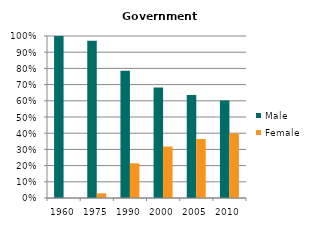
| Category | Male | Female |
|---|---|---|
| 1960.0 | 1 | 0 |
| 1975.0 | 0.971 | 0.029 |
| 1990.0 | 0.786 | 0.214 |
| 2000.0 | 0.682 | 0.318 |
| 2005.0 | 0.636 | 0.364 |
| 2010.0 | 0.601 | 0.399 |